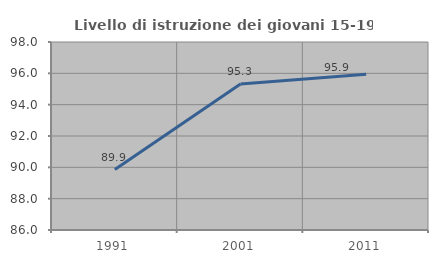
| Category | Livello di istruzione dei giovani 15-19 anni |
|---|---|
| 1991.0 | 89.855 |
| 2001.0 | 95.312 |
| 2011.0 | 95.946 |